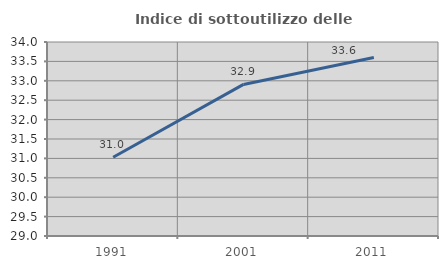
| Category | Indice di sottoutilizzo delle abitazioni  |
|---|---|
| 1991.0 | 31.03 |
| 2001.0 | 32.907 |
| 2011.0 | 33.601 |